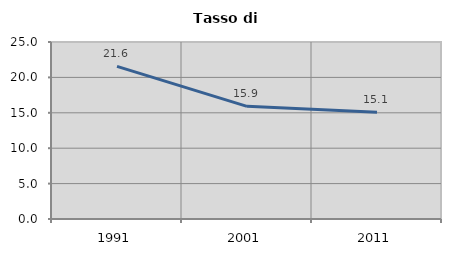
| Category | Tasso di disoccupazione   |
|---|---|
| 1991.0 | 21.562 |
| 2001.0 | 15.916 |
| 2011.0 | 15.062 |